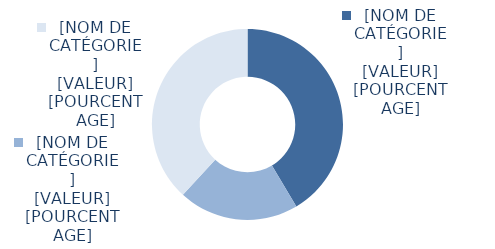
| Category | Series 0 |
|---|---|
| Genève | 7820 |
| Autres cantons | 3843 |
| A l'étranger | 7202 |